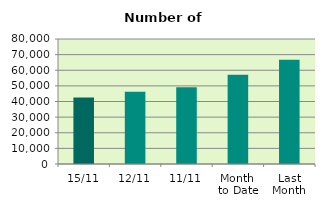
| Category | Series 0 |
|---|---|
| 15/11 | 42568 |
| 12/11 | 46302 |
| 11/11 | 49150 |
| Month 
to Date | 57177.818 |
| Last
Month | 66688.857 |